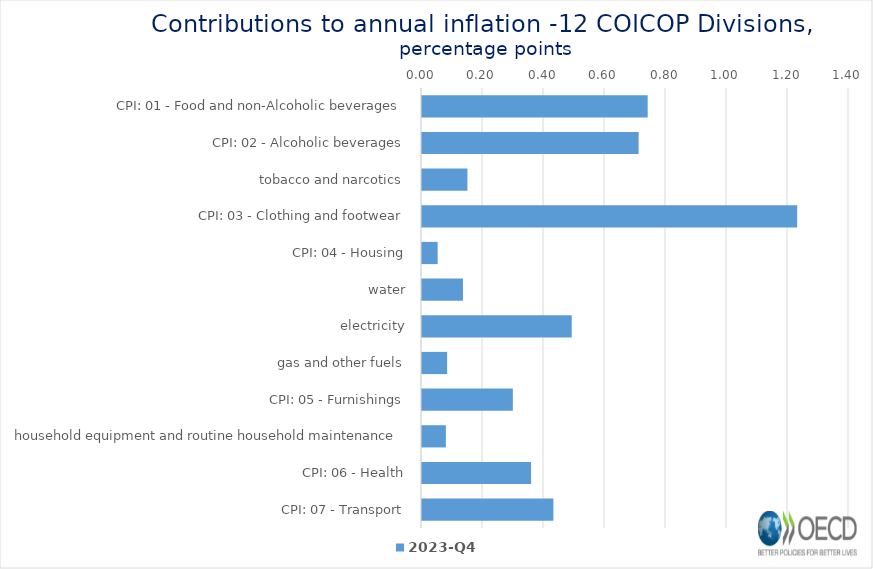
| Category | 2023-Q4 |
|---|---|
| CPI: 01 - Food and non-Alcoholic beverages | 0.74 |
| CPI: 02 - Alcoholic beverages, tobacco and narcotics | 0.71 |
| CPI: 03 - Clothing and footwear | 0.149 |
| CPI: 04 - Housing, water, electricity, gas and other fuels | 1.23 |
| CPI: 05 - Furnishings, household equipment and routine household maintenance | 0.051 |
| CPI: 06 - Health | 0.134 |
| CPI: 07 - Transport | 0.491 |
| CPI: 08 - Communication | 0.082 |
| CPI: 09 - Recreation and culture | 0.298 |
| CPI: 10 - Education | 0.078 |
| CPI: 11 - Restaurants and hotels | 0.358 |
| CPI: 12 - Miscellaneous goods and services | 0.431 |